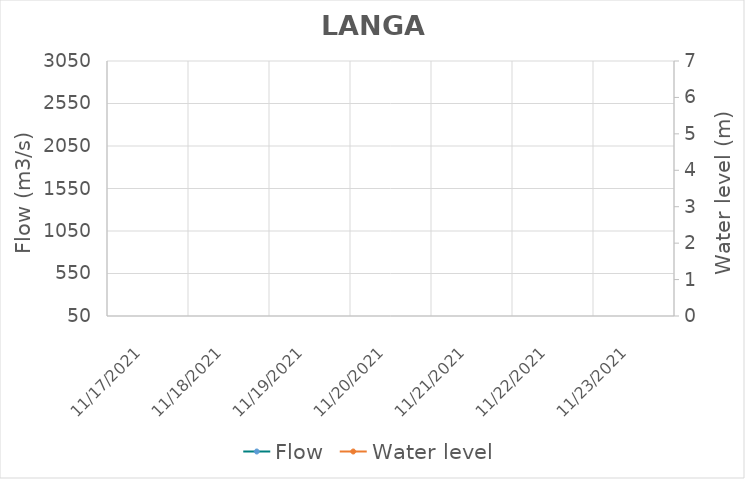
| Category | Flow |
|---|---|
| 11/1/21 | 945.56 |
| 10/31/21 | 893.57 |
| 10/30/21 | 948.97 |
| 10/29/21 | 986.17 |
| 10/28/21 | 1006.92 |
| 10/27/21 | 976 |
| 10/26/21 | 943.03 |